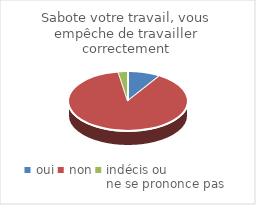
| Category | Sabote votre travail, vous empêche de travailler correctement |
|---|---|
| oui | 7 |
| non | 69 |
| indécis ou 
ne se prononce pas | 2 |